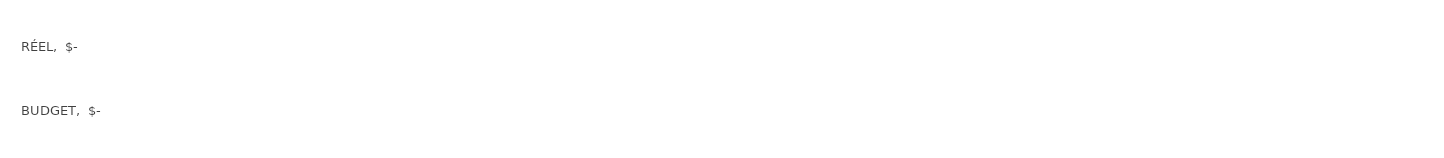
| Category | Series 0 |
|---|---|
| BUDGET | 0 |
| RÉEL | 0 |